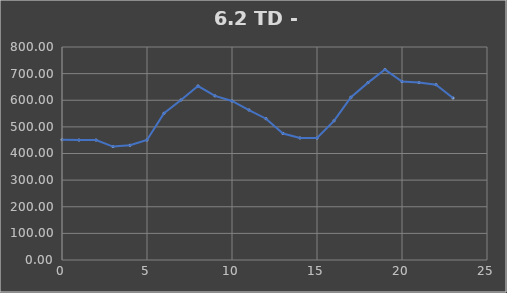
| Category | TOTAL |
|---|---|
| 0.0 | 451.954 |
| 1.0 | 450.504 |
| 2.0 | 450.504 |
| 3.0 | 425.884 |
| 4.0 | 430.894 |
| 5.0 | 450.604 |
| 6.0 | 551.004 |
| 7.0 | 601.004 |
| 8.0 | 653.379 |
| 9.0 | 616.216 |
| 10.0 | 597.216 |
| 11.0 | 563.306 |
| 12.0 | 530.616 |
| 13.0 | 475.216 |
| 14.0 | 458.279 |
| 15.0 | 457.979 |
| 16.0 | 522.689 |
| 17.0 | 611.459 |
| 18.0 | 666.216 |
| 19.0 | 715.216 |
| 20.0 | 670.126 |
| 21.0 | 666.216 |
| 22.0 | 658.379 |
| 23.0 | 608.379 |